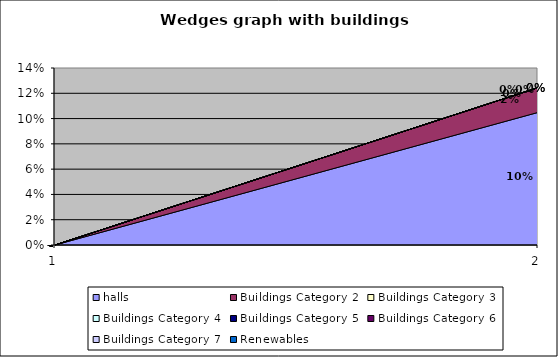
| Category |  halls  |  Buildings Category 2  |  Buildings Category 3  |  Buildings Category 4  |  Buildings Category 5  |  Buildings Category 6  |  Buildings Category 7  | Renewables |
|---|---|---|---|---|---|---|---|---|
| 0 | 0 | 0 | 0 | 0 | 0 | 0 | 0 | 0 |
| 1 | 0.105 | 0.02 | 0 | 0 | 0 | 0 | 0 | 0 |